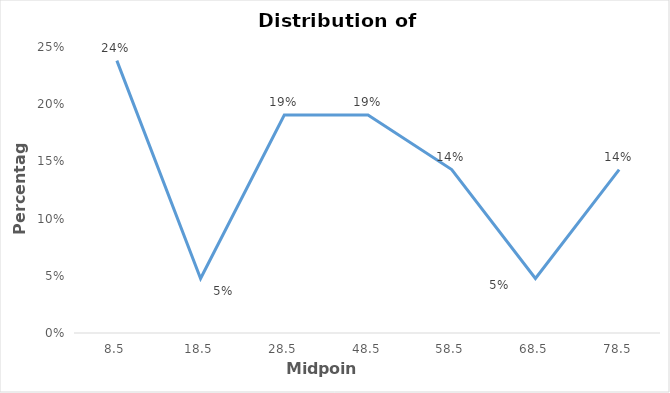
| Category | Series 0 |
|---|---|
| 8.5 | 0.238 |
| 18.5 | 0.048 |
| 28.5 | 0.19 |
| 48.5 | 0.19 |
| 58.5 | 0.143 |
| 68.5 | 0.048 |
| 78.5 | 0.143 |